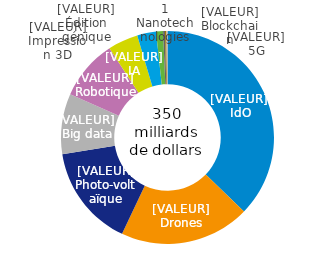
| Category | 2018 |
|---|---|
| IdO | 130 |
| Drones | 69 |
| Photovoltaïque | 54 |
| Big Data | 32 |
| Robotique | 32 |
| IA | 16 |
| Impression 3D | 10 |
| Édition génique | 3.7 |
| Nanotechnologies | 1 |
| Blockchain | 0.7 |
| 5G | 0.6 |